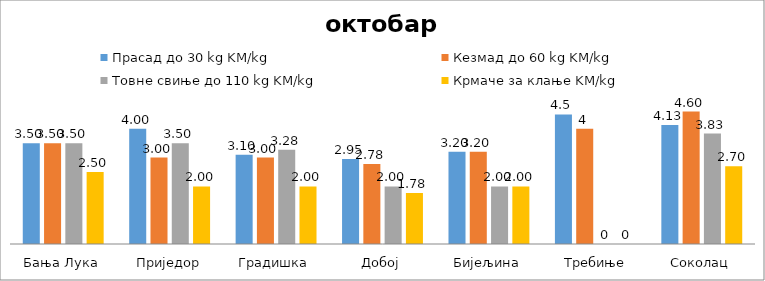
| Category | Прасад до 30 kg KM/kg | Кезмад до 60 kg KM/kg | Товне свиње до 110 kg KM/kg | Крмаче за клање KM/kg |
|---|---|---|---|---|
| Бања Лука | 3.5 | 3.5 | 3.5 | 2.5 |
| Приједор | 4 | 3 | 3.5 | 2 |
| Градишка | 3.1 | 3 | 3.275 | 2 |
| Добој | 2.95 | 2.775 | 2 | 1.775 |
| Бијељина | 3.2 | 3.2 | 2 | 2 |
|  Требиње | 4.5 | 4 | 0 | 0 |
| Соколац | 4.133 | 4.6 | 3.833 | 2.7 |